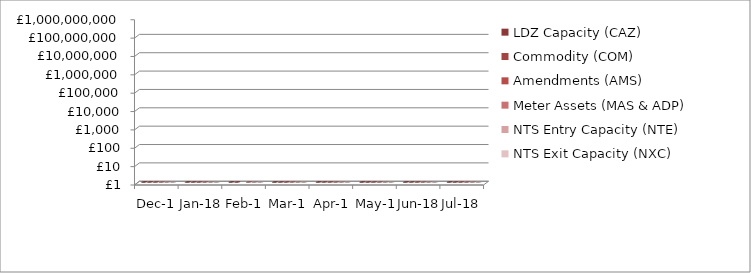
| Category | LDZ Capacity (CAZ) | Commodity (COM) | Amendments (AMS) | Meter Assets (MAS & ADP) | NTS Entry Capacity (NTE) | NTS Exit Capacity (NXC) |
|---|---|---|---|---|---|---|
| 2017-12-01 | 299923728.54 | 49314715.49 | 486751.91 | 193840.34 | 12089719.21 | 18734838.83 |
| 2018-01-01 | 300085873.04 | 51013861.41 | 398601 | 193840 | 13468961.26 | 18693319.21 |
| 2018-02-01 | 271243893.07 | 49577294.91 | -97584.69 | 175082.41 | 10887736.94 | 16944144.32 |
| 2018-03-01 | 300714752.62 | 47885458.16 | 435828.94 | 193565.33 | 12522228.64 | 16944144.32 |
| 2018-04-01 | 302200317.27 | 29034584.31 | 1543453.44 | 194233.3 | 1577511.57 | 18111359.22 |
| 2018-05-01 | 312174512.16 | 19449237 | 2024085.07 | 200707.08 | 1599795.55 | 18702620.75 |
| 2018-06-01 | 302299412.99 | 14591606.04 | 2213969.29 | 194233.54 | 1621553.61 | 18117525.2 |
| 2018-07-01 | 312562745.62 | 14290600.7 | 1483244.96 | 200707.69 | 1735803.71 | 18720256.49 |